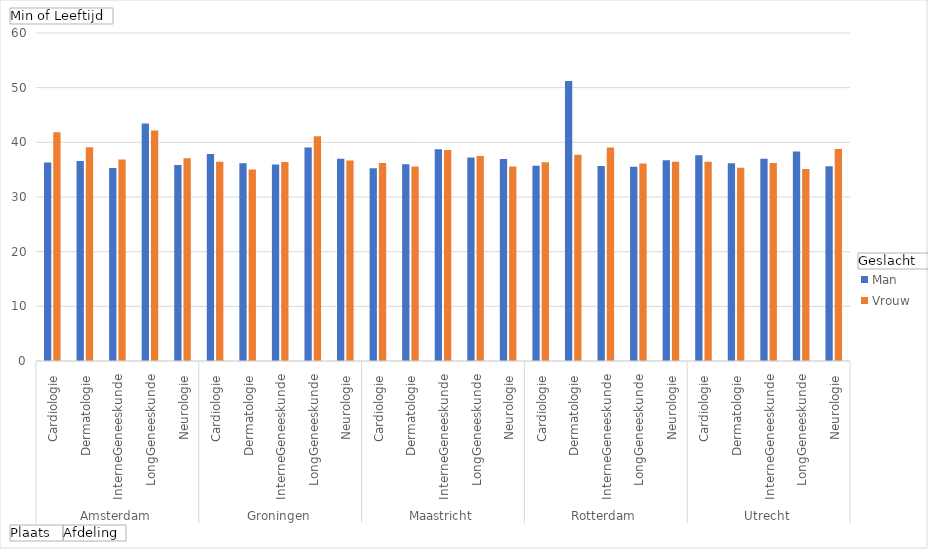
| Category | Man | Vrouw |
|---|---|---|
| 0 | 36.327 | 41.84 |
| 1 | 36.602 | 39.122 |
| 2 | 35.301 | 36.861 |
| 3 | 43.448 | 42.175 |
| 4 | 35.844 | 37.091 |
| 5 | 37.878 | 36.429 |
| 6 | 36.166 | 35.018 |
| 7 | 35.965 | 36.381 |
| 8 | 39.061 | 41.126 |
| 9 | 36.999 | 36.67 |
| 10 | 35.248 | 36.199 |
| 11 | 36.011 | 35.588 |
| 12 | 38.721 | 38.595 |
| 13 | 37.222 | 37.496 |
| 14 | 36.968 | 35.599 |
| 15 | 35.71 | 36.335 |
| 16 | 51.213 | 37.739 |
| 17 | 35.682 | 39.036 |
| 18 | 35.553 | 36.143 |
| 19 | 36.704 | 36.467 |
| 20 | 37.658 | 36.463 |
| 21 | 36.171 | 35.345 |
| 22 | 37.012 | 36.216 |
| 23 | 38.342 | 35.106 |
| 24 | 35.605 | 38.779 |